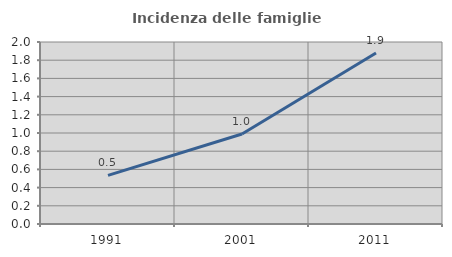
| Category | Incidenza delle famiglie numerose |
|---|---|
| 1991.0 | 0.534 |
| 2001.0 | 0.988 |
| 2011.0 | 1.879 |